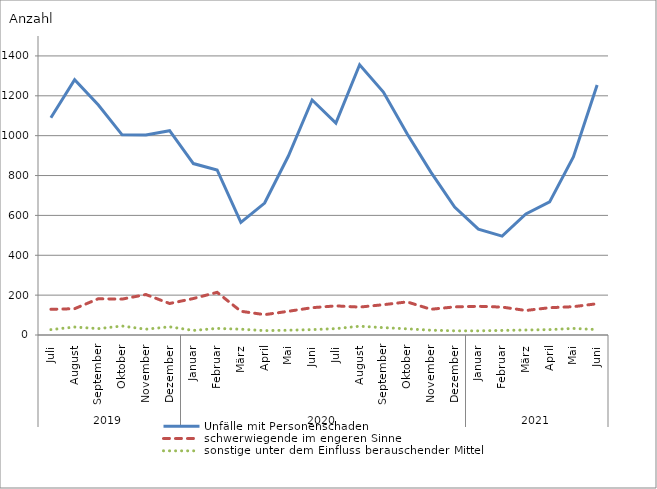
| Category | Unfälle mit Personenschaden | schwerwiegende im engeren Sinne | sonstige unter dem Einfluss berauschender Mittel |
|---|---|---|---|
| 0 | 1090 | 129 | 27 |
| 1 | 1281 | 132 | 40 |
| 2 | 1154 | 182 | 32 |
| 3 | 1004 | 180 | 45 |
| 4 | 1003 | 203 | 29 |
| 5 | 1025 | 158 | 41 |
| 6 | 860 | 183 | 23 |
| 7 | 828 | 214 | 33 |
| 8 | 565 | 119 | 29 |
| 9 | 662 | 102 | 22 |
| 10 | 898 | 119 | 24 |
| 11 | 1179 | 137 | 27 |
| 12 | 1063 | 146 | 32 |
| 13 | 1356 | 140 | 44 |
| 14 | 1219 | 152 | 37 |
| 15 | 1010 | 166 | 31 |
| 16 | 817 | 129 | 24 |
| 17 | 642 | 141 | 21 |
| 18 | 531 | 144 | 21 |
| 19 | 496 | 140 | 23 |
| 20 | 607 | 123 | 25 |
| 21 | 668 | 137 | 27 |
| 22 | 893 | 142 | 33 |
| 23 | 1254 | 157 | 27 |